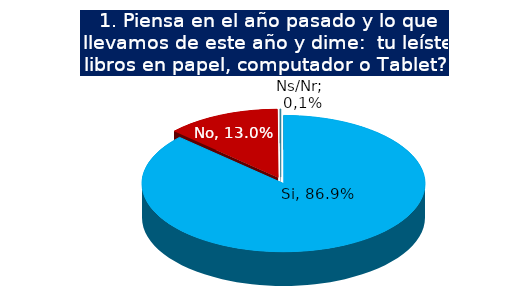
| Category | Series 0 |
|---|---|
| Si | 0.869 |
| No | 0.13 |
| Ns/Nr | 0.001 |